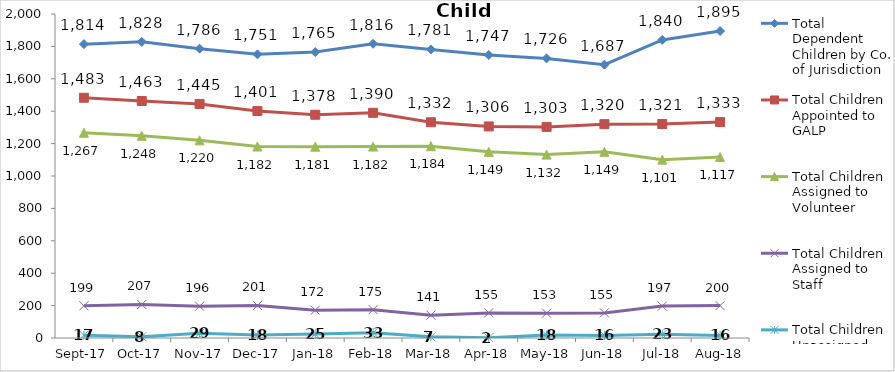
| Category | Total Dependent Children by Co. of Jurisdiction | Total Children Appointed to GALP | Total Children Assigned to Volunteer | Total Children Assigned to Staff | Total Children Unassigned |
|---|---|---|---|---|---|
| 2017-09-01 | 1814 | 1483 | 1267 | 199 | 17 |
| 2017-10-01 | 1828 | 1463 | 1248 | 207 | 8 |
| 2017-11-01 | 1786 | 1445 | 1220 | 196 | 29 |
| 2017-12-01 | 1751 | 1401 | 1182 | 201 | 18 |
| 2018-01-01 | 1765 | 1378 | 1181 | 172 | 25 |
| 2018-02-01 | 1816 | 1390 | 1182 | 175 | 33 |
| 2018-03-01 | 1781 | 1332 | 1184 | 141 | 7 |
| 2018-04-01 | 1747 | 1306 | 1149 | 155 | 2 |
| 2018-05-01 | 1726 | 1303 | 1132 | 153 | 18 |
| 2018-06-01 | 1687 | 1320 | 1149 | 155 | 16 |
| 2018-07-01 | 1840 | 1321 | 1101 | 197 | 23 |
| 2018-08-01 | 1895 | 1333 | 1117 | 200 | 16 |